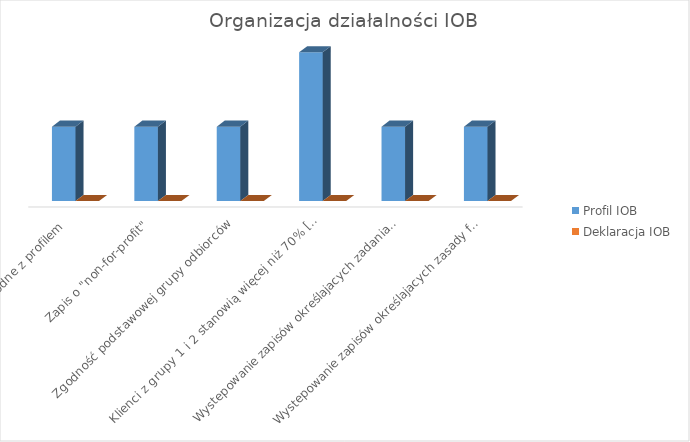
| Category | Profil IOB | Deklaracja IOB |
|---|---|---|
| Przedmiot i zakres działania zgodne z profilem | 1 | 0 |
| Zapis o "non-for-profit" | 1 | 0 |
| Zgodność podstawowej grupy odbiorców | 1 | 0 |
| Klienci z grupy 1 i 2 stanowią więcej niż 70% [usługi prorozwojowe] | 2 | 0 |
| Wystepowanie zapisów określajacych zadania i sposób organizacyjny | 1 | 0 |
| Wystepowanie zapisów określajacych zasady funkcjonowania. | 1 | 0 |